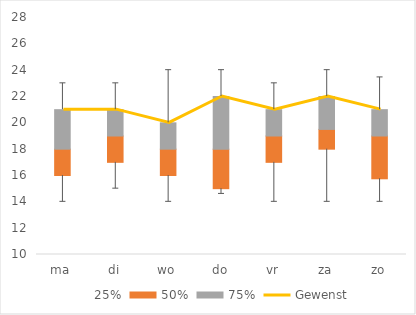
| Category | 25% | 50% | 75% |
|---|---|---|---|
| ma | 16 | 2 | 3 |
| di | 17 | 2 | 2 |
| wo | 16 | 2 | 2 |
| do | 15 | 3 | 4 |
| vr | 17 | 2 | 2 |
| za | 18 | 1.5 | 2.5 |
| zo | 15.75 | 3.25 | 2 |